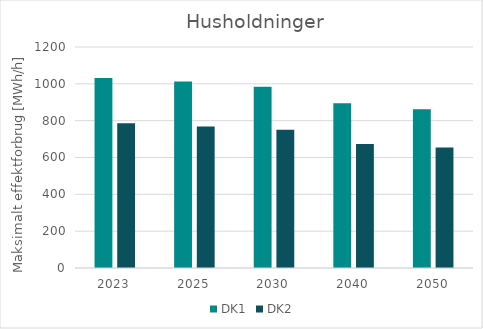
| Category | DK1 | DK2 |
|---|---|---|
| 2023.0 | 1031.499 | 786.11 |
| 2025.0 | 1013.058 | 768.283 |
| 2030.0 | 984.405 | 751.258 |
| 2040.0 | 894.685 | 673.168 |
| 2050.0 | 862.531 | 654.249 |